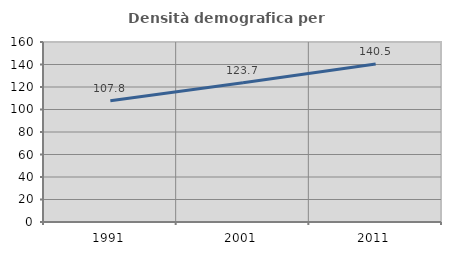
| Category | Densità demografica |
|---|---|
| 1991.0 | 107.807 |
| 2001.0 | 123.723 |
| 2011.0 | 140.507 |